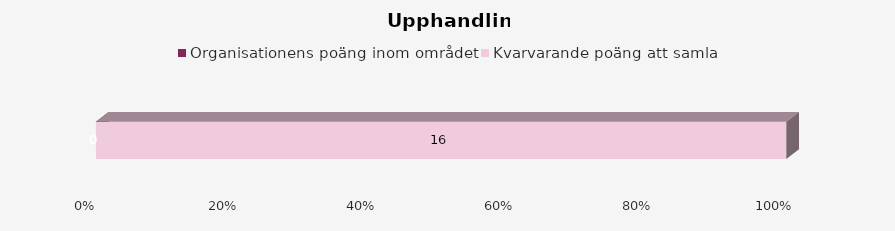
| Category | Organisationens poäng inom området | Kvarvarande poäng att samla |
|---|---|---|
| 0 | 0 | 16 |